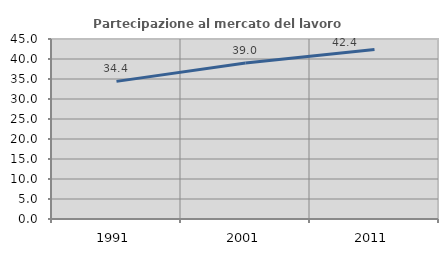
| Category | Partecipazione al mercato del lavoro  femminile |
|---|---|
| 1991.0 | 34.407 |
| 2001.0 | 38.982 |
| 2011.0 | 42.398 |